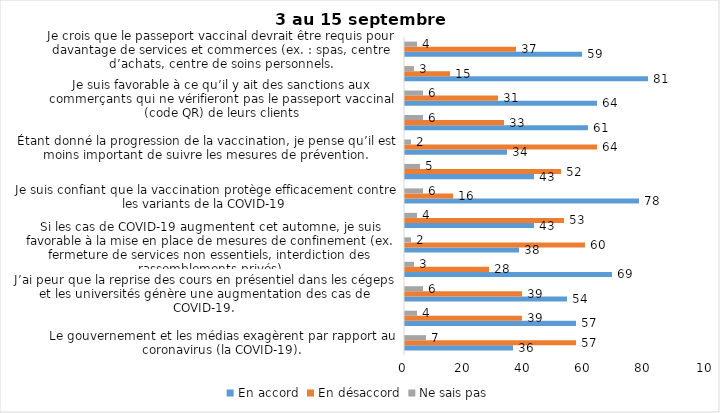
| Category | En accord | En désaccord | Ne sais pas |
|---|---|---|---|
| Le gouvernement et les médias exagèrent par rapport au coronavirus (la COVID-19). | 36 | 57 | 7 |
| J’ai peur que le système de santé soit débordé par les cas de COVID-19 suite au "déconfinement" | 57 | 39 | 4 |
| J’ai peur que la reprise des cours en présentiel dans les cégeps et les universités génère une augmentation des cas de COVID-19. | 54 | 39 | 6 |
| Je suis favorable au passeport vaccinal qui permettrait l'accès à certains lieux ou activités aux personnes vaccinées. | 69 | 28 | 3 |
| Si les cas de COVID-19 augmentent cet automne, je suis favorable à la mise en place de mesures de confinement (ex. fermeture de services non essentiels, interdiction des rassemblements privés) | 38 | 60 | 2 |
| Je suis inquiet de contracter le variant Delta de la Covid-19 | 43 | 53 | 4 |
| Je suis confiant que la vaccination protège efficacement contre les variants de la COVID-19 | 78 | 16 | 6 |
| Je suis favorable à ce que le port du masque ne soit plus obligatoire au Québec. | 43 | 52 | 5 |
| Étant donné la progression de la vaccination, je pense qu’il est moins important de suivre les mesures de prévention. | 34 | 64 | 2 |
| J'ai peur que la reprise des cours en présentiel dans les écoles primaires et secondaires génère une augmentation des cas de COVID-19 | 61 | 33 | 6 |
| Je suis favorable à ce qu’il y ait des sanctions aux commerçants qui ne vérifieront pas le passeport vaccinal (code QR) de leurs clients | 64 | 31 | 6 |
| Je suis favorable à ce qu’il y ait des sanctions aux gens qui tenteront de frauder leur passeport vaccinal par des amendes ou des accusations criminelles. | 81 | 15 | 3 |
| Je crois que le passeport vaccinal devrait être requis pour davantage de services et commerces (ex. : spas, centre d’achats, centre de soins personnels. | 59 | 37 | 4 |